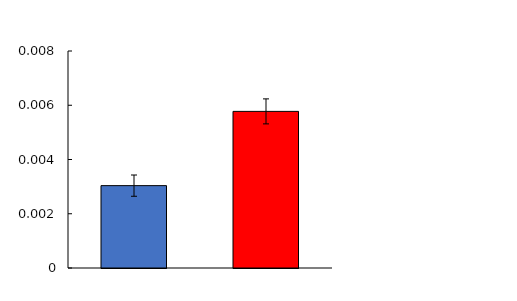
| Category | Series 0 |
|---|---|
| Veh | 0.003 |
| DT | 0.006 |